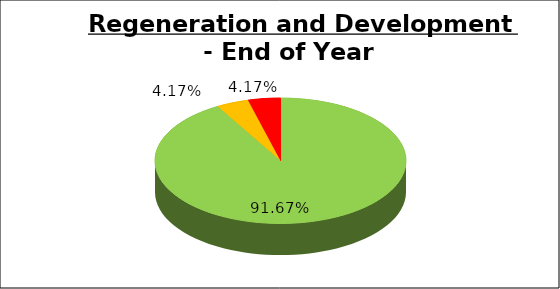
| Category | Q4 |
|---|---|
| Green | 0.917 |
| Amber | 0.042 |
| Red | 0.042 |